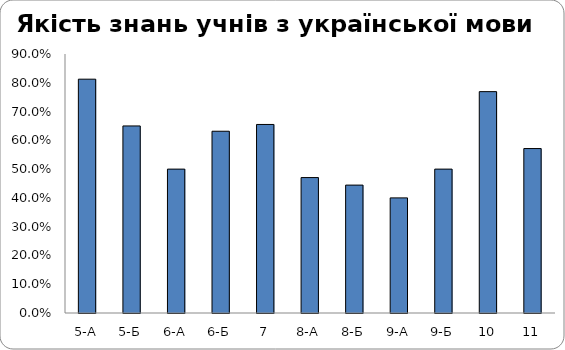
| Category | Series 0 |
|---|---|
| 5-А | 0.812 |
| 5-Б | 0.65 |
| 6-А | 0.5 |
| 6-Б | 0.632 |
| 7 | 0.655 |
| 8-А | 0.471 |
| 8-Б | 0.444 |
| 9-А | 0.4 |
| 9-Б | 0.5 |
| 10 | 0.769 |
| 11 | 0.571 |